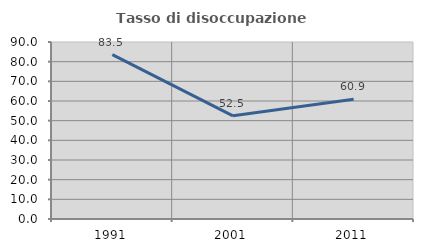
| Category | Tasso di disoccupazione giovanile  |
|---|---|
| 1991.0 | 83.544 |
| 2001.0 | 52.475 |
| 2011.0 | 60.924 |